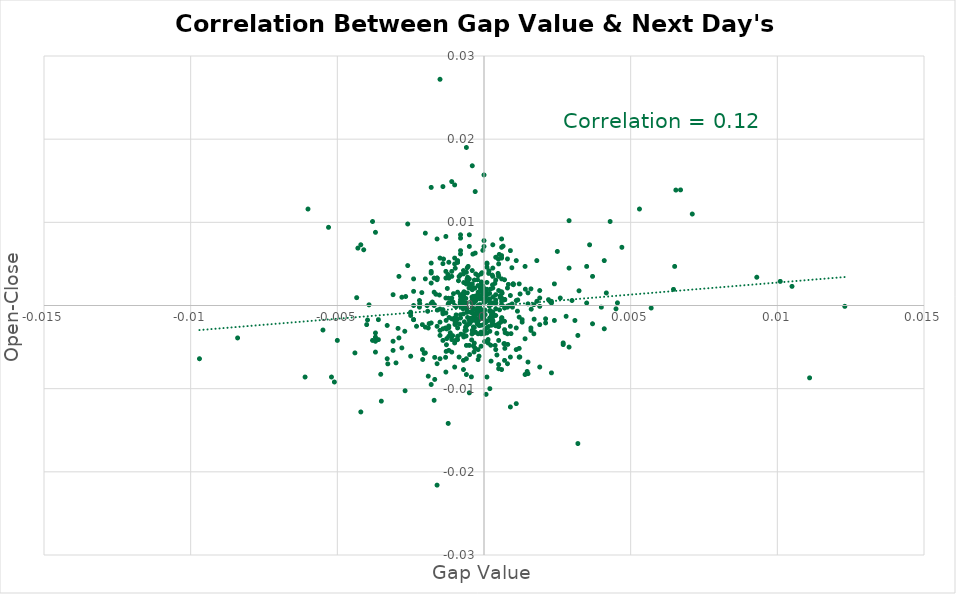
| Category | Series 0 |
|---|---|
| -0.00107000000000001 | -0.004 |
| -0.000199999999999978 | 0.001 |
| -0.000219999999999998 | -0.002 |
| -2.99999999999744e-05 | 0.001 |
| -0.000619999999999953 | 0.001 |
| -0.00168000000000001 | -0.009 |
| -0.000559999999999893 | 0.003 |
| -0.000340000000000007 | 0.002 |
| -0.00126999999999999 | -0.003 |
| 0.000290000000000012 | -0.001 |
| 0.00048999999999999 | 0.006 |
| -0.000630000000000019 | 0 |
| -0.000580000000000024 | -0.001 |
| -0.00152000000000007 | 0.001 |
| 0.000439999999999995 | -0.006 |
| 0.000229999999999952 | -0.001 |
| -0.00119999999999997 | -0.002 |
| 0.000249999999999972 | -0.002 |
| -0.000170000000000003 | -0.002 |
| -0.000750000000000028 | 0.001 |
| 0.000990000000000046 | 0.003 |
| 0.000379999999999935 | -0.005 |
| -0.000850000000000017 | -0.006 |
| -0.000650000000000039 | -0.003 |
| -0.000460000000000016 | -0.001 |
| -0.000359999999999915 | -0.005 |
| -0.000809999999999977 | 0 |
| -0.00292999999999998 | -0.003 |
| 2.99999999999744e-05 | 0 |
| 0.000950000000000006 | 0.005 |
| 0.000240000000000018 | -0.007 |
| 0.000140000000000029 | -0.005 |
| 5.99999999999489e-05 | -0.002 |
| -0.0011000000000001 | -0.004 |
| -0.00194000000000005 | 0 |
| -0.000390000000000001 | 0 |
| -3.99999999999289e-05 | 0.002 |
| -0.00138000000000004 | 0.006 |
| -0.000219999999999998 | 0.003 |
| 9.99999999999889e-05 | 0.002 |
| -0.00392000000000003 | 0 |
| 0.00149999999999994 | 0.002 |
| 0.000309999999999921 | 0.001 |
| 0.000480000000000036 | 0.004 |
| -0.000210000000000043 | 0.001 |
| -0.000340000000000007 | -0.006 |
| 0.00113999999999991 | -0.001 |
| -0.000689999999999968 | -0.004 |
| -2.99999999999744e-05 | 0.002 |
| -0.000950000000000006 | 0 |
| -0.00163999999999997 | 0.001 |
| -0.000230000000000063 | -0.002 |
| -0.000329999999999941 | -0.005 |
| 0.000650000000000039 | 0.007 |
| -0.000960000000000071 | -0.002 |
| -0.000280000000000058 | 0.001 |
| -0.000990000000000046 | -0.002 |
| -0.00119000000000002 | -0.001 |
| -0.0012899999999999 | -0.006 |
| -0.000109999999999943 | 0.001 |
| -0.00170000000000003 | 0 |
| -0.00209000000000003 | -0.006 |
| -0.00114999999999998 | -0.003 |
| -2.000000000002e-05 | 0.001 |
| -0.00127999999999994 | -0.005 |
| -0.000800000000000022 | -0.002 |
| -0.00268999999999997 | -0.01 |
| -0.00352000000000007 | -0.008 |
| -0.00048999999999999 | -0.006 |
| -0.00121999999999999 | -0.014 |
| -0.000460000000000016 | -0.002 |
| 7.00000000000145e-05 | -0.011 |
| -0.000870000000000037 | 0.003 |
| -0.00129000000000001 | -0.002 |
| -0.00190000000000001 | -0.009 |
| -0.000310000000000032 | 0.002 |
| -0.000419999999999975 | -0.004 |
| 0.00146999999999997 | -0.008 |
| -0.00186999999999992 | -0.002 |
| 0.000269999999999992 | -0.002 |
| 0.00653999999999999 | 0.014 |
| -0.00433999999999989 | 0.001 |
| -0.00327999999999995 | -0.007 |
| -0.00397000000000002 | -0.002 |
| 0.000710000000000099 | 0.001 |
| -0.00097999999999998 | -0.002 |
| -0.000369999999999981 | -0.001 |
| -0.00139999999999995 | 0.005 |
| -0.000219999999999998 | 0 |
| -0.000249999999999972 | -0.001 |
| -0.000719999999999942 | 0 |
| -0.000129999999999963 | -0.002 |
| -0.000600000000000044 | -0.003 |
| 0.000969999999999915 | 0 |
| -0.00106000000000006 | 0 |
| 0.00119999999999997 | -0.005 |
| 0.000560000000000004 | 0.001 |
| -0.000750000000000028 | 0 |
| -0.000329999999999941 | 0 |
| 9.99999999999889e-05 | 0.003 |
| 0.000200000000000089 | -0.002 |
| -0.000969999999999915 | -0.002 |
| -0.000410000000000021 | 0.001 |
| -0.00125000000000008 | 0.002 |
| -0.000369999999999981 | 0.001 |
| 0.000800000000000022 | 0 |
| -0.00150000000000005 | 0 |
| -0.00119999999999997 | -0.003 |
| -0.00121000000000004 | 0.001 |
| -0.00126999999999999 | -0.004 |
| 9.99999999999889e-05 | 0.001 |
| -0.000329999999999941 | 0.003 |
| -0.000560000000000004 | 0.003 |
| -0.000419999999999975 | 0 |
| -0.000340000000000007 | 0 |
| 2.99999999999744e-05 | -0.002 |
| -0.000140000000000029 | 0 |
| 0.000520000000000076 | 0.006 |
| 0.000439999999999995 | -0.003 |
| 0.000219999999999998 | 0.002 |
| 0.000170000000000003 | 0.004 |
| 0.000139999999999918 | -0.004 |
| 0.000599999999999933 | 0.002 |
| 0.00455000000000005 | 0 |
| -0.00097999999999998 | 0.004 |
| -0.00548999999999999 | -0.003 |
| -0.000219999999999998 | -0.002 |
| -0.000290000000000012 | 0.001 |
| -0.000149999999999983 | 0 |
| -0.000360000000000027 | -0.003 |
| 0.00225999999999992 | 0 |
| 3.00000000000855e-05 | -0.003 |
| 0.000220000000000109 | -0.002 |
| -0.000789999999999957 | -0.003 |
| 0.00324000000000002 | 0.002 |
| 0.000920000000000031 | -0.003 |
| -0.000390000000000001 | 0 |
| -9.99999999999889e-05 | 0.003 |
| -0.000120000000000009 | 0.002 |
| -0.000340000000000007 | 0.001 |
| 0.000400000000000067 | 0.001 |
| -0.000709999999999988 | 0.001 |
| -0.000410000000000021 | -0.003 |
| 0.000529999999999919 | -0.001 |
| 0.000569999999999959 | -0.002 |
| -0.000300000000000078 | 0 |
| -0.00158999999999998 | -0.001 |
| 0.00646000000000002 | 0.002 |
| 4.99999999999944e-05 | 0.001 |
| -0.00212000000000001 | 0.002 |
| -0.000569999999999959 | 0.005 |
| -0.000670000000000059 | -0.002 |
| 0.000400000000000067 | 0.003 |
| -0.000580000000000024 | 0.003 |
| -0.00046999999999997 | -0.002 |
| 0.000410000000000021 | -0.002 |
| 0.000870000000000037 | 0 |
| -0.00266999999999995 | 0.001 |
| 0.000149999999999983 | -0.003 |
| 4.000000000004e-05 | -0.001 |
| -4.99999999999944e-05 | -0.002 |
| -0.000129999999999963 | -0.002 |
| -0.000329999999999941 | -0.003 |
| -0.00180000000000002 | 0 |
| -0.000149999999999983 | 0.001 |
| -0.000240000000000018 | -0.001 |
| 0.000159999999999938 | 0.004 |
| -0.000399999999999955 | 0 |
| 0.000719999999999942 | -0.003 |
| -4.000000000004e-05 | 0.007 |
| -0.000459999999999904 | 0.002 |
| -0.000139999999999918 | 0.002 |
| -0.000839999999999951 | -0.002 |
| -0.000430000000000041 | -0.009 |
| 0.00122999999999995 | 0.001 |
| 0.00121999999999999 | -0.006 |
| 0.0 | 0.002 |
| 0.000290000000000012 | 0.002 |
| -0.000539999999999984 | 0.005 |
| -0.000380000000000047 | 0.006 |
| 0.000609999999999999 | -0.001 |
| 0.000260000000000038 | -0.002 |
| 0.000829999999999997 | 0.003 |
| 0.000809999999999977 | -0.005 |
| 0.000179999999999958 | 0 |
| 0.000379999999999935 | -0.002 |
| -9.00000000000345e-05 | -0.001 |
| -0.000190000000000023 | -0.002 |
| -0.000109999999999943 | 0 |
| 0.000229999999999952 | -0.005 |
| -0.000849999999999906 | 0.003 |
| -0.000809999999999977 | 0 |
| 0.00170999999999998 | -0.002 |
| -0.00131000000000003 | -0.006 |
| 0.0 | 0.002 |
| 0.000480000000000036 | -0.002 |
| -0.000210000000000043 | -0.002 |
| -0.00192000000000003 | -0.001 |
| 0.000400000000000067 | 0.001 |
| 0.000189999999999912 | 0.001 |
| -0.000690000000000079 | 0.003 |
| 2.000000000002e-05 | -0.004 |
| -0.000390000000000001 | -0.002 |
| 0.000619999999999953 | 0.001 |
| -0.000540000000000096 | 0.003 |
| -0.000680000000000013 | 0.002 |
| 0.000549999999999939 | 0.001 |
| -0.00103999999999993 | 0.001 |
| -0.000279999999999947 | 0.004 |
| 0.000370000000000092 | 0.003 |
| -0.00219000000000002 | 0 |
| -0.000950000000000006 | -0.004 |
| -6.000000000006e-05 | -0.002 |
| -7.00000000000145e-05 | 0.004 |
| -0.00121999999999999 | 0 |
| -0.000900000000000011 | -0.003 |
| -0.000940000000000051 | -0.002 |
| -8.99999999999234e-05 | 0.003 |
| -0.000580000000000024 | -0.001 |
| -0.00051000000000001 | 0.002 |
| -0.000580000000000024 | -0.002 |
| -0.000109999999999943 | 0.002 |
| 0.000249999999999972 | -0.001 |
| -0.00168000000000001 | -0.006 |
| -0.000800000000000022 | 0 |
| -0.000630000000000019 | -0.003 |
| 0.000430000000000041 | -0.002 |
| -0.000400000000000067 | 0.003 |
| -0.00204000000000004 | -0.006 |
| 0.00417 | 0.002 |
| -0.000199999999999978 | -0.002 |
| -0.000950000000000006 | -0.001 |
| -0.000110000000000054 | 0.002 |
| 0.00141000000000002 | 0.002 |
| -0.000369999999999981 | -0.003 |
| 0.000500000000000056 | -0.003 |
| -0.000770000000000048 | 0.001 |
| 0.00115000000000009 | 0.001 |
| 0.000279999999999947 | -0.002 |
| 0.000279999999999947 | 0.004 |
| -0.000569999999999959 | 0.002 |
| 0.00095999999999996 | 0 |
| -0.000379999999999935 | -0.003 |
| -0.00175999999999998 | 0 |
| -0.000170000000000003 | -0.006 |
| -0.000699999999999922 | 0.001 |
| -0.00130999999999992 | -0.003 |
| -0.00122999999999995 | 0.004 |
| -0.000309999999999921 | -0.005 |
| -0.000589999999999979 | -0.002 |
| 0.000680000000000013 | -0.005 |
| -0.000609999999999999 | -0.004 |
| -0.000560000000000004 | -0.001 |
| 0.000709999999999988 | -0.005 |
| -0.000129999999999963 | -0.001 |
| 3.00000000000855e-05 | -0.001 |
| 0.000269999999999992 | -0.001 |
| 0.00161 | 0 |
| 0.0 | -0.002 |
| -0.000499999999999944 | -0.002 |
| -0.00119999999999997 | -0.005 |
| 9.99999999999889e-05 | -0.003 |
| -0.000299999999999967 | -0.001 |
| -0.000399999999999955 | -0.001 |
| -0.00209999999999999 | -0.002 |
| 0.000599999999999933 | -0.002 |
| -0.0001000000000001 | -0.003 |
| -0.001 | 0.006 |
| -0.000199999999999978 | -0.001 |
| 0.00179999999999991 | 0 |
| -0.000200000000000089 | 0.004 |
| -0.00509999999999999 | -0.009 |
| -0.00529999999999997 | 0.009 |
| 0.00369999999999992 | -0.002 |
| -9.99999999999889e-05 | -0.001 |
| 0.000399999999999955 | 0 |
| -0.000600000000000044 | 0 |
| 0.000200000000000089 | 0 |
| -0.00150000000000005 | -0.004 |
| -0.00109999999999999 | 0.004 |
| -0.001 | -0.007 |
| -0.00109999999999999 | -0.002 |
| -0.00609999999999999 | -0.009 |
| -0.000600000000000044 | -0.005 |
| -0.000799999999999911 | 0.007 |
| 0.000699999999999922 | -0.003 |
| -0.000700000000000033 | 0.001 |
| -0.00129999999999996 | 0.004 |
| -0.00330000000000008 | -0.006 |
| -0.000400000000000067 | -0.002 |
| 0.000800000000000022 | -0.007 |
| -0.000299999999999967 | -0.003 |
| 0.000599999999999933 | -0.002 |
| -0.000200000000000089 | -0.003 |
| 9.99999999999889e-05 | 0.005 |
| -0.00179999999999991 | -0.002 |
| 0.00190000000000001 | -0.002 |
| -0.00259999999999993 | 0.01 |
| 0.000700000000000033 | 0.003 |
| -0.000199999999999978 | -0.002 |
| 0.00139999999999995 | -0.004 |
| 0.0 | 0.007 |
| 0.0 | -0.003 |
| -0.000700000000000033 | 0.004 |
| -0.000500000000000056 | 0.003 |
| -0.00149999999999994 | -0.002 |
| -0.00160000000000004 | -0.003 |
| -0.000700000000000033 | -0.003 |
| -0.00109999999999999 | 0.001 |
| -0.00109999999999999 | -0.004 |
| -9.99999999999889e-05 | -0.003 |
| -9.99999999999889e-05 | 0.004 |
| -0.0008999999999999 | 0.005 |
| -0.00109999999999999 | -0.006 |
| 0.00170000000000003 | 0 |
| -0.00180000000000002 | 0.004 |
| -0.00109999999999999 | 0.015 |
| 9.99999999999889e-05 | 0.001 |
| -0.000600000000000044 | 0 |
| 0.001 | 0.003 |
| -0.00119999999999997 | 0 |
| 0.000700000000000033 | 0.001 |
| -0.00279999999999991 | 0.001 |
| -0.004 | -0.002 |
| -0.00309999999999999 | -0.005 |
| -0.000800000000000022 | 0.004 |
| 0.00209999999999999 | -0.002 |
| 0.000499999999999944 | -0.008 |
| -0.000499999999999944 | 0.003 |
| -0.000700000000000033 | 0 |
| 0.000499999999999944 | 0.005 |
| -0.00119999999999997 | 0.003 |
| -0.00139999999999995 | 0 |
| 9.99999999999889e-05 | -0.003 |
| 0.00429999999999997 | 0.01 |
| -0.000799999999999911 | 0.008 |
| 0.00109999999999999 | 0.005 |
| -0.00160000000000004 | 0.008 |
| 0.00229999999999996 | -0.008 |
| -0.001 | -0.002 |
| -0.000299999999999967 | 0.001 |
| -0.000400000000000067 | 0.004 |
| 0.000299999999999967 | 0.004 |
| 0.000600000000000044 | 0 |
| -0.00359999999999993 | -0.004 |
| -0.001 | -0.005 |
| -0.00370000000000003 | -0.004 |
| -0.000700000000000033 | 0.001 |
| 0.000799999999999911 | 0.006 |
| -0.00239999999999995 | -0.002 |
| 0.000300000000000078 | -0.001 |
| -9.99999999999889e-05 | 0.001 |
| 0.000500000000000056 | 0.004 |
| -0.00170000000000003 | 0.002 |
| -0.00360000000000004 | -0.002 |
| 0.000399999999999955 | 0.006 |
| 0.00249999999999994 | 0.006 |
| 0.00120000000000009 | 0.003 |
| -0.00419999999999998 | 0.007 |
| 0.000399999999999955 | 0 |
| 0.000900000000000011 | -0.002 |
| 0.000599999999999933 | -0.008 |
| 0.0001000000000001 | -0.009 |
| -0.00109999999999999 | 0.003 |
| 0.000600000000000044 | 0.006 |
| -0.00239999999999995 | -0.002 |
| -0.00129999999999996 | 0.008 |
| -0.00129999999999996 | -0.001 |
| -0.000800000000000022 | 0.001 |
| -0.000399999999999955 | -0.001 |
| 0.0 | 0.001 |
| -0.000499999999999944 | -0.002 |
| 0.0 | -0.001 |
| 0.000299999999999967 | 0.002 |
| -0.000699999999999922 | -0.001 |
| -0.000300000000000078 | -0.001 |
| -9.99999999999889e-05 | -0.001 |
| -0.000900000000000011 | -0.004 |
| 0.000300000000000078 | 0 |
| 0.000299999999999967 | -0.002 |
| -0.000300000000000078 | 0.006 |
| 0.000199999999999978 | -0.001 |
| 0.000299999999999967 | 0.004 |
| -0.000199999999999978 | 0 |
| 0.000600000000000044 | 0.001 |
| -0.000699999999999922 | 0.002 |
| 0.0 | 0 |
| -0.000400000000000067 | -0.003 |
| -0.000800000000000022 | 0.001 |
| 0.000400000000000067 | -0.001 |
| 0.00159999999999993 | -0.003 |
| -0.00160000000000004 | -0.007 |
| -0.00160000000000004 | 0.003 |
| -0.00270000000000003 | -0.003 |
| -0.000599999999999933 | -0.006 |
| 0.00190000000000001 | 0.002 |
| -0.000700000000000033 | 0 |
| 0.000700000000000033 | 0.001 |
| 0.000700000000000033 | -0.005 |
| -0.000900000000000011 | -0.004 |
| -0.000699999999999922 | -0.007 |
| 0.000300000000000078 | -0.002 |
| -0.002 | -0.006 |
| 0.000199999999999978 | -0.001 |
| -0.00170000000000003 | 0 |
| 0.00109999999999999 | 0.001 |
| 0.0008999999999999 | 0.001 |
| -0.000400000000000067 | 0.001 |
| 0.000400000000000067 | 0 |
| -0.000400000000000067 | 0.002 |
| 0.000700000000000033 | -0.007 |
| 9.99999999999889e-05 | 0.002 |
| -0.00130000000000007 | 0.001 |
| -0.00369999999999992 | -0.006 |
| 0.000200000000000089 | 0 |
| -0.001 | -0.002 |
| -0.00209999999999999 | -0.005 |
| 0.0101 | 0.003 |
| 0.00160000000000004 | -0.003 |
| 0.00270000000000003 | -0.004 |
| 0.000199999999999978 | 0 |
| 0.000299999999999967 | 0.007 |
| -0.00159999999999993 | 0.003 |
| 0.000700000000000033 | -0.002 |
| -0.000900000000000011 | 0.005 |
| 0.000499999999999944 | -0.007 |
| 0.0031000000000001 | -0.002 |
| -0.00129999999999996 | -0.008 |
| -0.000499999999999944 | -0.01 |
| 0.00239999999999995 | -0.002 |
| -0.000199999999999978 | 0.002 |
| -0.00970000000000004 | -0.006 |
| 0.00320000000000009 | -0.017 |
| 0.000499999999999944 | 0.002 |
| 0.00290000000000001 | -0.005 |
| -0.00150000000000005 | 0.006 |
| -0.00120000000000009 | 0.005 |
| 0.0008999999999999 | -0.006 |
| -0.000199999999999978 | 0 |
| -0.000599999999999933 | 0.019 |
| -0.00140000000000006 | -0.004 |
| -0.000800000000000133 | -0.001 |
| 0.000299999999999967 | -0.001 |
| -0.00499999999999989 | -0.004 |
| -0.00300000000000011 | -0.007 |
| -0.000399999999999955 | 0 |
| -0.00290000000000012 | 0.003 |
| -0.00229999999999996 | -0.002 |
| -0.000900000000000122 | 0.005 |
| 0.00130000000000007 | -0.002 |
| -0.000699999999999922 | 0 |
| -0.0008999999999999 | -0.002 |
| -0.000299999999999967 | -0.003 |
| 0.00299999999999989 | 0.001 |
| 9.99999999999889e-05 | -0.002 |
| 0.000499999999999944 | 0.004 |
| -0.000799999999999911 | 0.001 |
| -0.000199999999999978 | 0 |
| 0.0 | 0.001 |
| -0.000199999999999978 | -0.001 |
| 0.00119999999999986 | -0.006 |
| 0.000799999999999911 | -0.003 |
| 0.000499999999999944 | -0.002 |
| -0.00239999999999995 | 0.002 |
| -0.000999999999999889 | 0 |
| 0.00190000000000001 | 0 |
| -0.002 | -0.003 |
| -0.0011000000000001 | 0 |
| -0.000600000000000156 | 0.003 |
| 0.000600000000000156 | 0.008 |
| -0.00170000000000003 | 0.003 |
| -0.00259999999999993 | 0.005 |
| 0.00180000000000002 | 0.005 |
| 0.00119999999999986 | -0.001 |
| -0.00180000000000002 | 0.004 |
| 0.000699999999999922 | 0.001 |
| -0.00140000000000006 | -0.003 |
| -0.002 | 0.009 |
| 0.00219999999999998 | 0.001 |
| -0.00139999999999984 | -0.001 |
| 0.00239999999999995 | 0.003 |
| -0.002 | 0.003 |
| 0.00350000000000005 | 0 |
| 0.0071000000000001 | 0.011 |
| 0.000399999999999955 | -0.005 |
| 0.00569999999999992 | 0 |
| -0.000700000000000033 | -0.008 |
| -0.000599999999999933 | 0.004 |
| -0.00249999999999994 | -0.006 |
| -0.00129999999999985 | 0.003 |
| -0.000800000000000133 | 0.006 |
| 0.0 | 0.002 |
| -0.00139999999999984 | -0.001 |
| 0.0104999999999999 | 0.002 |
| -0.000199999999999978 | -0.006 |
| 0.000199999999999978 | -0.001 |
| -0.00180000000000002 | 0.003 |
| 0.000900000000000122 | 0.007 |
| 0.0011000000000001 | -0.005 |
| 0.00649999999999995 | 0.005 |
| 0.00130000000000007 | -0.002 |
| -0.00160000000000004 | 0.003 |
| -0.00180000000000002 | 0.005 |
| -0.000499999999999944 | -0.005 |
| -0.00370000000000003 | -0.003 |
| -0.00279999999999991 | -0.005 |
| 0.0011000000000001 | -0.003 |
| 0.000299999999999967 | -0.001 |
| 0.000600000000000044 | 0.007 |
| -0.000399999999999955 | 0.017 |
| 0.004 | 0 |
| 0.0111 | -0.009 |
| -0.000999999999999889 | 0.015 |
| 0.00669999999999992 | 0.014 |
| 0.00349999999999983 | 0.005 |
| 0.0 | 0.016 |
| -0.0042000000000002 | -0.013 |
| -0.00140000000000006 | 0.014 |
| -0.00160000000000004 | -0.022 |
| -0.000299999999999967 | 0.014 |
| 0.00260000000000004 | 0.001 |
| -0.006 | 0.012 |
| -0.00380000000000002 | 0.01 |
| -0.00370000000000003 | 0.009 |
| 0.00140000000000006 | -0.008 |
| -0.00249999999999994 | -0.001 |
| 0.0008999999999999 | -0.012 |
| -0.00150000000000005 | 0.027 |
| 0.00370000000000003 | 0.004 |
| -0.00249999999999994 | -0.001 |
| -0.00249999999999994 | -0.001 |
| -0.00429999999999997 | 0.007 |
| 0.000599999999999933 | 0.003 |
| -0.0008999999999999 | 0.002 |
| -0.00219999999999998 | 0 |
| -0.000600000000000156 | -0.008 |
| -0.000299999999999967 | -0.002 |
| 0.00229999999999996 | 0 |
| -0.00180000000000002 | 0.014 |
| 0.000199999999999978 | 0.001 |
| 0.00190000000000001 | -0.007 |
| -0.000599999999999933 | 0.003 |
| 0.000800000000000133 | 0.002 |
| -0.000499999999999944 | 0.007 |
| 0.0 | 0.008 |
| 0.00140000000000006 | 0.005 |
| -0.00239999999999995 | 0 |
| 0.000199999999999978 | -0.01 |
| 0.000599999999999933 | 0.006 |
| 0.000999999999999889 | 0.002 |
| -0.00290000000000012 | -0.004 |
| -0.0008999999999999 | 0.005 |
| -0.00370000000000003 | -0.004 |
| -0.000599999999999933 | 0 |
| -0.00519999999999998 | -0.009 |
| -0.00180000000000002 | -0.009 |
| 0.00209999999999999 | -0.002 |
| -0.00330000000000008 | -0.002 |
| -0.00239999999999995 | 0.003 |
| -0.00439999999999995 | -0.006 |
| -9.99999999999889e-05 | -0.005 |
| -0.00169999999999992 | -0.011 |
| -0.00309999999999999 | 0.001 |
| 0.00359999999999993 | 0.007 |
| 0.000599999999999933 | 0 |
| 0.00409999999999999 | 0.005 |
| 9.99999999999889e-05 | 0.005 |
| 0.00169999999999992 | -0.003 |
| 0.00409999999999999 | -0.003 |
| 0.0018999999999999 | 0.001 |
| 0.00470000000000003 | 0.007 |
| 9.99999999999889e-05 | 0.005 |
| 0.00159999999999993 | 0.002 |
| 0.00150000000000005 | -0.008 |
| 0.00319999999999998 | -0.004 |
| -0.00170000000000003 | 0 |
| 0.0028999999999999 | 0.01 |
| -0.00840000000000007 | -0.004 |
| -0.00120000000000009 | -0.004 |
| -9.99999999999889e-05 | 0.002 |
| 0.00149999999999994 | -0.007 |
| -0.000199999999999978 | -0.005 |
| -0.00379999999999991 | -0.004 |
| 0.0 | 0.001 |
| -0.001 | 0.005 |
| -0.000200000000000089 | 0.002 |
| 0.00929999999999997 | 0.003 |
| 0.00270000000000003 | -0.005 |
| -0.0041000000000001 | 0.007 |
| -0.00219999999999998 | 0.001 |
| -0.000499999999999944 | 0.008 |
| -0.000800000000000022 | 0.009 |
| 0.0122999999999999 | 0 |
| -0.00150000000000005 | -0.003 |
| -0.00190000000000001 | -0.003 |
| -0.0031000000000001 | -0.004 |
| 0.00530000000000008 | 0.012 |
| 0.00150000000000005 | 0 |
| 0.00109999999999999 | -0.012 |
| 0.000199999999999978 | -0.003 |
| 0.00290000000000001 | 0.005 |
| 0.000800000000000022 | 0 |
| 0.000500000000000056 | -0.004 |
| 0.00229999999999996 | 0.001 |
| 0.000700000000000033 | 0 |
| -0.000700000000000033 | 0.004 |
| -0.00349999999999994 | -0.011 |
| 0.00280000000000002 | -0.001 |
| -0.00150000000000005 | -0.006 |
| 0.00450000000000006 | 0 |